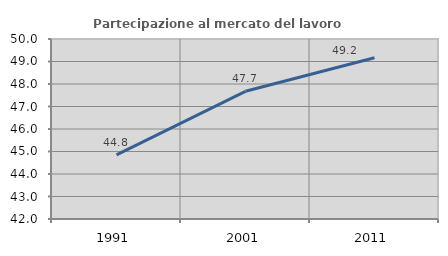
| Category | Partecipazione al mercato del lavoro  femminile |
|---|---|
| 1991.0 | 44.848 |
| 2001.0 | 47.676 |
| 2011.0 | 49.169 |